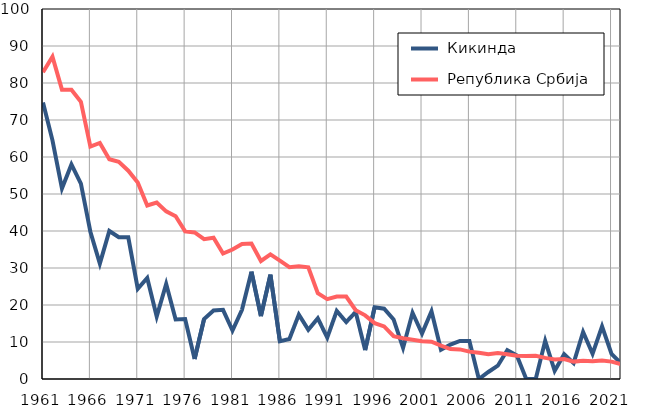
| Category |  Кикинда |  Република Србија |
|---|---|---|
| 1961.0 | 74.7 | 82.9 |
| 1962.0 | 64.5 | 87.1 |
| 1963.0 | 51.5 | 78.2 |
| 1964.0 | 58 | 78.2 |
| 1965.0 | 52.8 | 74.9 |
| 1966.0 | 39.8 | 62.8 |
| 1967.0 | 31.2 | 63.8 |
| 1968.0 | 40 | 59.4 |
| 1969.0 | 38.3 | 58.7 |
| 1970.0 | 38.3 | 56.3 |
| 1971.0 | 24.4 | 53.1 |
| 1972.0 | 27.3 | 46.9 |
| 1973.0 | 16.9 | 47.7 |
| 1974.0 | 25.7 | 45.3 |
| 1975.0 | 16.1 | 44 |
| 1976.0 | 16.2 | 39.9 |
| 1977.0 | 5.4 | 39.6 |
| 1978.0 | 16.2 | 37.8 |
| 1979.0 | 18.5 | 38.2 |
| 1980.0 | 18.7 | 33.9 |
| 1981.0 | 13.1 | 35 |
| 1982.0 | 18.7 | 36.5 |
| 1983.0 | 29 | 36.6 |
| 1984.0 | 17 | 31.9 |
| 1985.0 | 28.2 | 33.7 |
| 1986.0 | 10.2 | 32 |
| 1987.0 | 10.8 | 30.2 |
| 1988.0 | 17.4 | 30.5 |
| 1989.0 | 13.3 | 30.2 |
| 1990.0 | 16.4 | 23.2 |
| 1991.0 | 11.2 | 21.6 |
| 1992.0 | 18.4 | 22.3 |
| 1993.0 | 15.4 | 22.3 |
| 1994.0 | 18.1 | 18.6 |
| 1995.0 | 7.8 | 17.2 |
| 1996.0 | 19.4 | 15.1 |
| 1997.0 | 19 | 14.2 |
| 1998.0 | 16.1 | 11.6 |
| 1999.0 | 8.4 | 11 |
| 2000.0 | 17.9 | 10.6 |
| 2001.0 | 12.3 | 10.2 |
| 2002.0 | 18.3 | 10.1 |
| 2003.0 | 7.9 | 9 |
| 2004.0 | 9.3 | 8.1 |
| 2005.0 | 10.3 | 8 |
| 2006.0 | 10.3 | 7.4 |
| 2007.0 | 0 | 7.1 |
| 2008.0 | 1.9 | 6.7 |
| 2009.0 | 3.6 | 7 |
| 2010.0 | 7.8 | 6.7 |
| 2011.0 | 6.4 | 6.3 |
| 2012.0 | 0 | 6.2 |
| 2013.0 | 0 | 6.3 |
| 2014.0 | 10.3 | 5.7 |
| 2015.0 | 2.2 | 5.3 |
| 2016.0 | 6.7 | 5.4 |
| 2017.0 | 4.3 | 4.7 |
| 2018.0 | 12.7 | 4.9 |
| 2019.0 | 6.8 | 4.8 |
| 2020.0 | 14.2 | 5 |
| 2021.0 | 6.8 | 4.7 |
| 2022.0 | 4.2 | 4 |